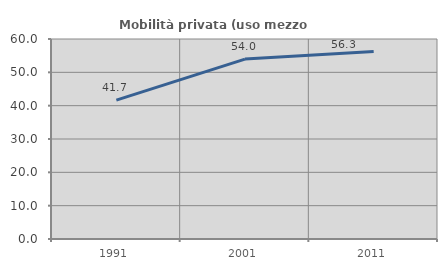
| Category | Mobilità privata (uso mezzo privato) |
|---|---|
| 1991.0 | 41.667 |
| 2001.0 | 53.982 |
| 2011.0 | 56.267 |